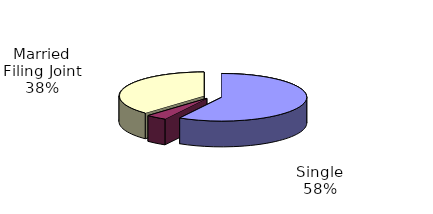
| Category | Series 0 |
|---|---|
| Single | 2280339 |
| Married Filing Separate | 155102 |
| Married Filing Joint | 1482318 |